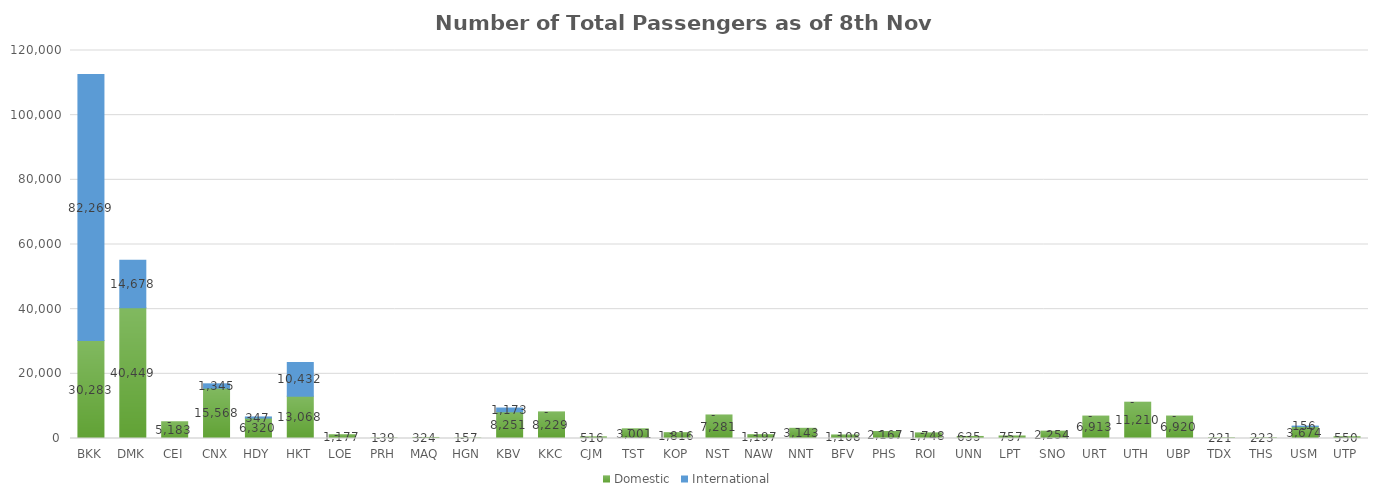
| Category | Domestic | International |
|---|---|---|
| BKK | 30283 | 82269 |
| DMK | 40449 | 14678 |
| CEI | 5183 | 0 |
| CNX | 15568 | 1345 |
| HDY | 6320 | 347 |
| HKT | 13068 | 10432 |
| LOE | 1177 | 0 |
| PRH | 139 | 0 |
| MAQ | 324 | 0 |
| HGN | 157 | 0 |
| KBV | 8251 | 1173 |
| KKC | 8229 | 0 |
| CJM | 516 | 0 |
| TST | 3001 | 0 |
| KOP | 1816 | 0 |
| NST | 7281 | 0 |
| NAW | 1197 | 0 |
| NNT | 3143 | 0 |
| BFV | 1108 | 0 |
| PHS | 2167 | 0 |
| ROI | 1748 | 0 |
| UNN | 635 | 0 |
| LPT | 757 | 0 |
| SNO | 2254 | 0 |
| URT | 6913 | 0 |
| UTH | 11210 | 0 |
| UBP | 6920 | 0 |
| TDX | 221 | 0 |
| THS | 223 | 0 |
| USM | 3674 | 156 |
| UTP | 550 | 0 |